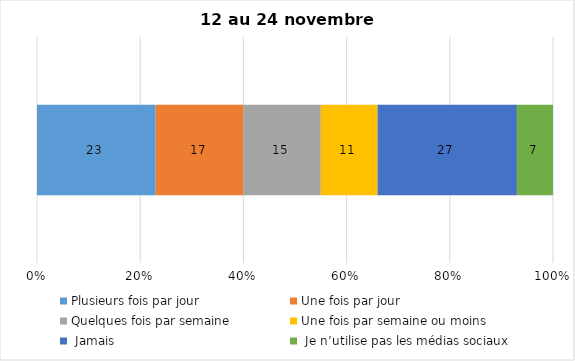
| Category | Plusieurs fois par jour | Une fois par jour | Quelques fois par semaine   | Une fois par semaine ou moins   |  Jamais   |  Je n’utilise pas les médias sociaux |
|---|---|---|---|---|---|---|
| 0 | 23 | 17 | 15 | 11 | 27 | 7 |